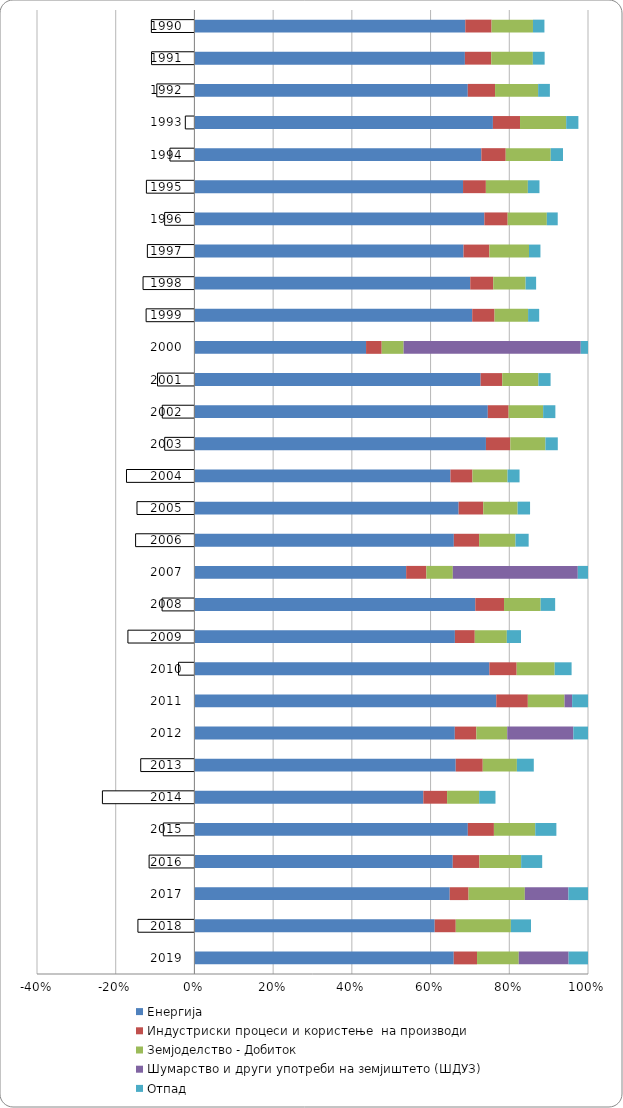
| Category | Енергија | Индустриски процеси и користење  на производи | Земјоделство - Добиток  | Шумарство и други употреби на земјиштето (ШДУЗ) | Отпад |
|---|---|---|---|---|---|
| 1990.0 | 0.884 | 0.086 | 0.135 | -0.142 | 0.037 |
| 1991.0 | 0.881 | 0.086 | 0.136 | -0.141 | 0.038 |
| 1992.0 | 0.861 | 0.086 | 0.136 | -0.12 | 0.037 |
| 1993.0 | 0.797 | 0.072 | 0.123 | -0.026 | 0.033 |
| 1994.0 | 0.835 | 0.071 | 0.131 | -0.073 | 0.036 |
| 1995.0 | 0.906 | 0.077 | 0.142 | -0.164 | 0.039 |
| 1996.0 | 0.871 | 0.07 | 0.118 | -0.091 | 0.033 |
| 1997.0 | 0.902 | 0.087 | 0.133 | -0.159 | 0.038 |
| 1998.0 | 0.952 | 0.079 | 0.112 | -0.179 | 0.036 |
| 1999.0 | 0.939 | 0.076 | 0.113 | -0.165 | 0.037 |
| 2000.0 | 0.436 | 0.04 | 0.056 | 0.45 | 0.018 |
| 2001.0 | 0.898 | 0.068 | 0.113 | -0.117 | 0.038 |
| 2002.0 | 0.894 | 0.063 | 0.105 | -0.099 | 0.037 |
| 2003.0 | 0.875 | 0.073 | 0.105 | -0.091 | 0.037 |
| 2004.0 | 0.997 | 0.086 | 0.137 | -0.267 | 0.047 |
| 2005.0 | 0.951 | 0.089 | 0.124 | -0.209 | 0.045 |
| 2006.0 | 0.944 | 0.092 | 0.132 | -0.216 | 0.048 |
| 2007.0 | 0.538 | 0.051 | 0.067 | 0.318 | 0.026 |
| 2008.0 | 0.857 | 0.088 | 0.112 | -0.1 | 0.044 |
| 2009.0 | 1.004 | 0.077 | 0.124 | -0.258 | 0.055 |
| 2010.0 | 0.818 | 0.076 | 0.105 | -0.045 | 0.047 |
| 2011.0 | 0.767 | 0.08 | 0.093 | 0.019 | 0.04 |
| 2012.0 | 0.662 | 0.055 | 0.079 | 0.168 | 0.037 |
| 2013.0 | 0.916 | 0.095 | 0.12 | -0.19 | 0.059 |
| 2014.0 | 1.098 | 0.114 | 0.154 | -0.444 | 0.078 |
| 2015.0 | 0.828 | 0.079 | 0.125 | -0.096 | 0.064 |
| 2016.0 | 0.856 | 0.088 | 0.138 | -0.152 | 0.07 |
| 2017.0 | 0.649 | 0.048 | 0.143 | 0.111 | 0.05 |
| 2018.0 | 0.86 | 0.075 | 0.197 | -0.204 | 0.072 |
| 2019.0 | 0.659 | 0.059 | 0.106 | 0.127 | 0.049 |